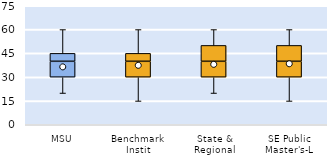
| Category | 25th | 50th | 75th |
|---|---|---|---|
| MSU | 30 | 10 | 5 |
| Benchmark Instit | 30 | 10 | 5 |
| State & Regional | 30 | 10 | 10 |
| SE Public Master's-L | 30 | 10 | 10 |